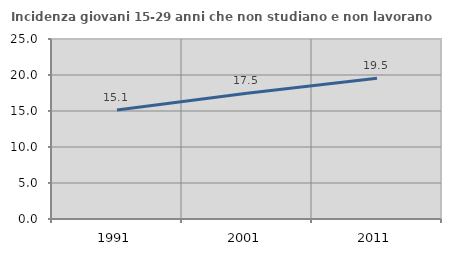
| Category | Incidenza giovani 15-29 anni che non studiano e non lavorano  |
|---|---|
| 1991.0 | 15.133 |
| 2001.0 | 17.479 |
| 2011.0 | 19.534 |